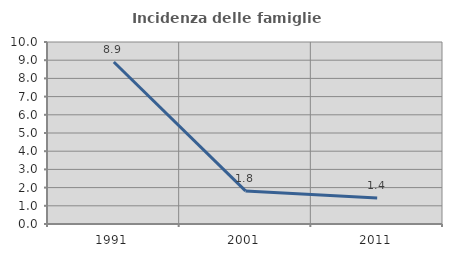
| Category | Incidenza delle famiglie numerose |
|---|---|
| 1991.0 | 8.899 |
| 2001.0 | 1.818 |
| 2011.0 | 1.423 |